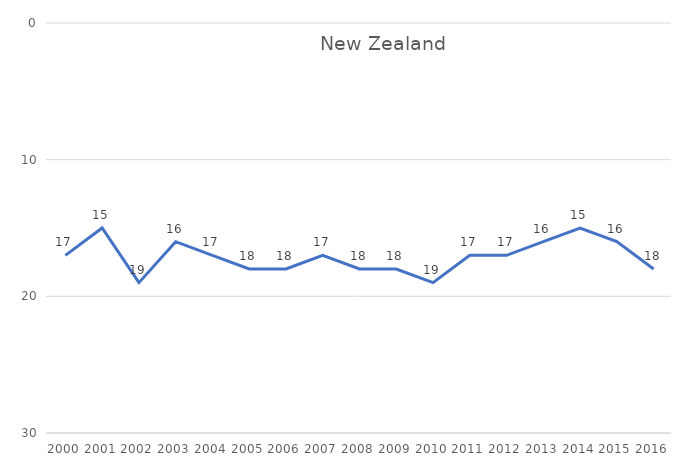
| Category | New Zealand |
|---|---|
| 2000 | 17 |
| 2001 | 15 |
| 2002 | 19 |
| 2003 | 16 |
| 2004 | 17 |
| 2005 | 18 |
| 2006 | 18 |
| 2007 | 17 |
| 2008 | 18 |
| 2009 | 18 |
| 2010 | 19 |
| 2011 | 17 |
| 2012 | 17 |
| 2013 | 16 |
| 2014 | 15 |
| 2015 | 16 |
| 2016 | 18 |